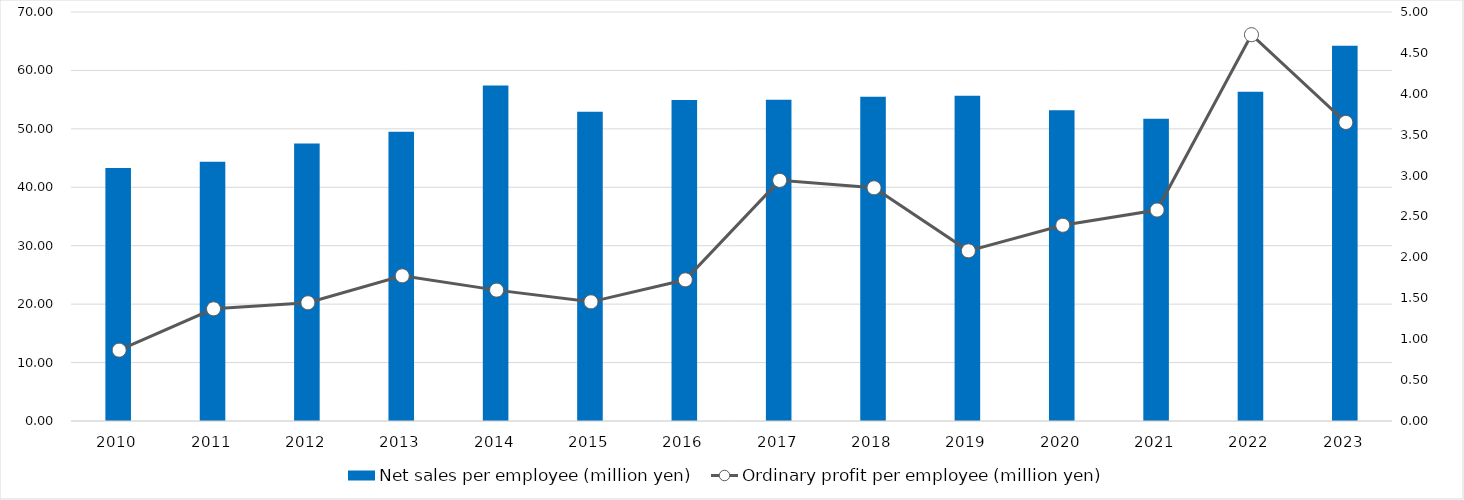
| Category | Net sales per employee (million yen) |
|---|---|
| 2010 | 43.298 |
| 2011 | 44.373 |
| 2012 | 47.505 |
| 2013 | 49.516 |
| 2014 | 57.432 |
| 2015 | 52.909 |
| 2016 | 54.948 |
| 2017 | 54.979 |
| 2018 | 55.51 |
| 2019 | 55.662 |
| 2020 | 53.187 |
| 2021 | 51.716 |
| 2022 | 56.337 |
| 2023 | 64.205 |